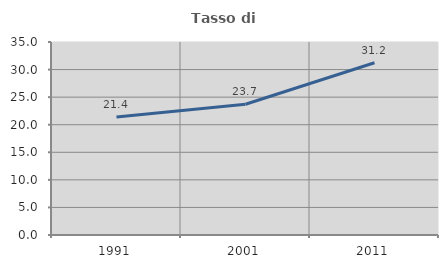
| Category | Tasso di occupazione   |
|---|---|
| 1991.0 | 21.417 |
| 2001.0 | 23.718 |
| 2011.0 | 31.243 |